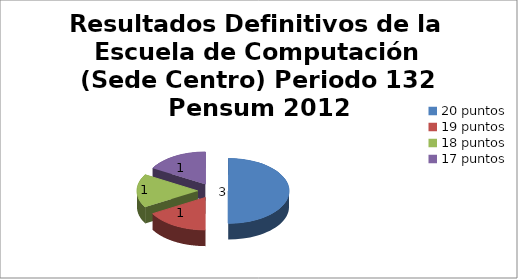
| Category | Series 0 |
|---|---|
| 20 puntos | 3 |
| 19 puntos | 1 |
| 18 puntos | 1 |
| 17 puntos | 1 |